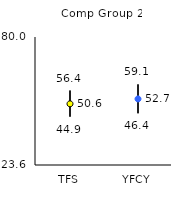
| Category | 25th | 75th | Mean |
|---|---|---|---|
| TFS | 44.9 | 56.4 | 50.55 |
| YFCY | 46.4 | 59.1 | 52.71 |